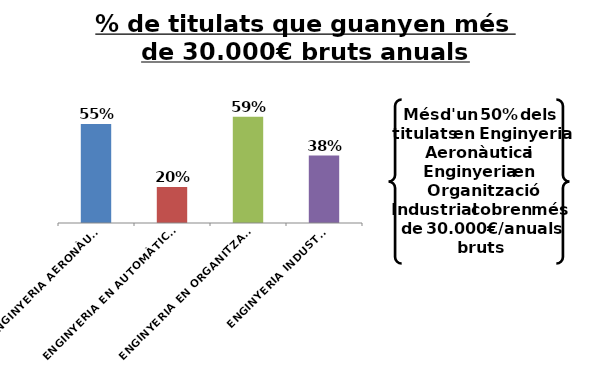
| Category | Series 0 |
|---|---|
| ENGINYERIA AERONÀUTICA | 0.55 |
| ENGINYERIA EN AUTOMÀTICA I ELECTRÒNICA INDUSTRIAL | 0.2 |
| ENGINYERIA EN ORGANITZACIÓ INDUSTRIAL | 0.591 |
| ENGINYERIA INDUSTRIAL | 0.375 |